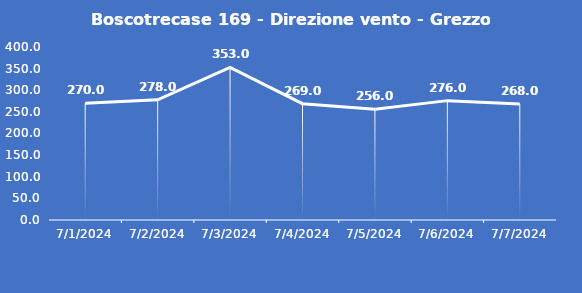
| Category | Boscotrecase 169 - Direzione vento - Grezzo (°N) |
|---|---|
| 7/1/24 | 270 |
| 7/2/24 | 278 |
| 7/3/24 | 353 |
| 7/4/24 | 269 |
| 7/5/24 | 256 |
| 7/6/24 | 276 |
| 7/7/24 | 268 |